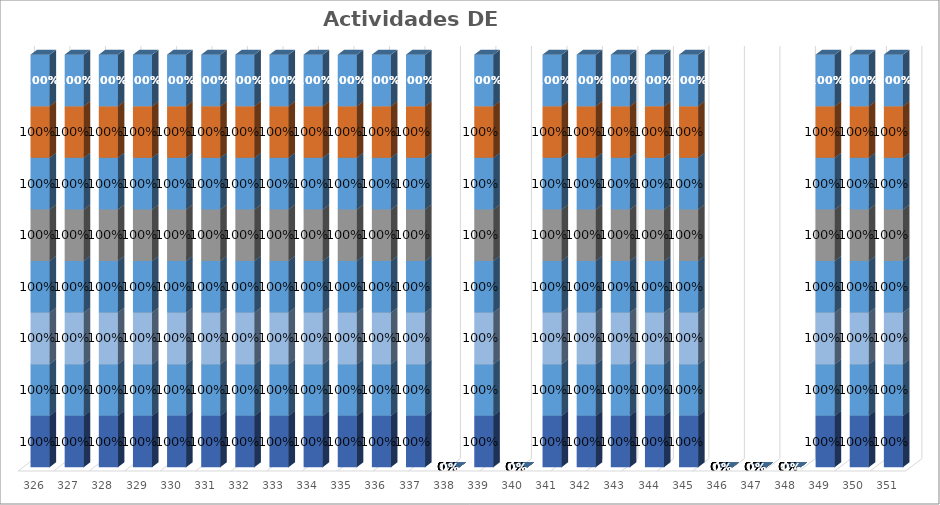
| Category | % Avance |
|---|---|
| 326.0 | 1 |
| 327.0 | 1 |
| 328.0 | 1 |
| 329.0 | 1 |
| 330.0 | 1 |
| 331.0 | 1 |
| 332.0 | 1 |
| 333.0 | 1 |
| 334.0 | 1 |
| 335.0 | 1 |
| 336.0 | 1 |
| 337.0 | 1 |
| 338.0 | 0 |
| 339.0 | 1 |
| 340.0 | 0 |
| 341.0 | 1 |
| 342.0 | 1 |
| 343.0 | 1 |
| 344.0 | 1 |
| 345.0 | 1 |
| 346.0 | 0 |
| 347.0 | 0 |
| 348.0 | 0 |
| 349.0 | 1 |
| 350.0 | 1 |
| 351.0 | 1 |